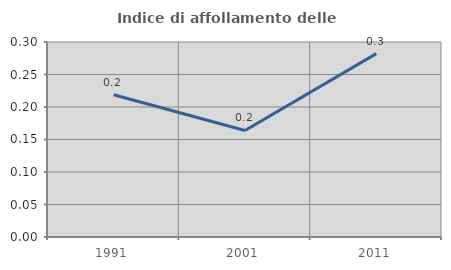
| Category | Indice di affollamento delle abitazioni  |
|---|---|
| 1991.0 | 0.219 |
| 2001.0 | 0.164 |
| 2011.0 | 0.282 |